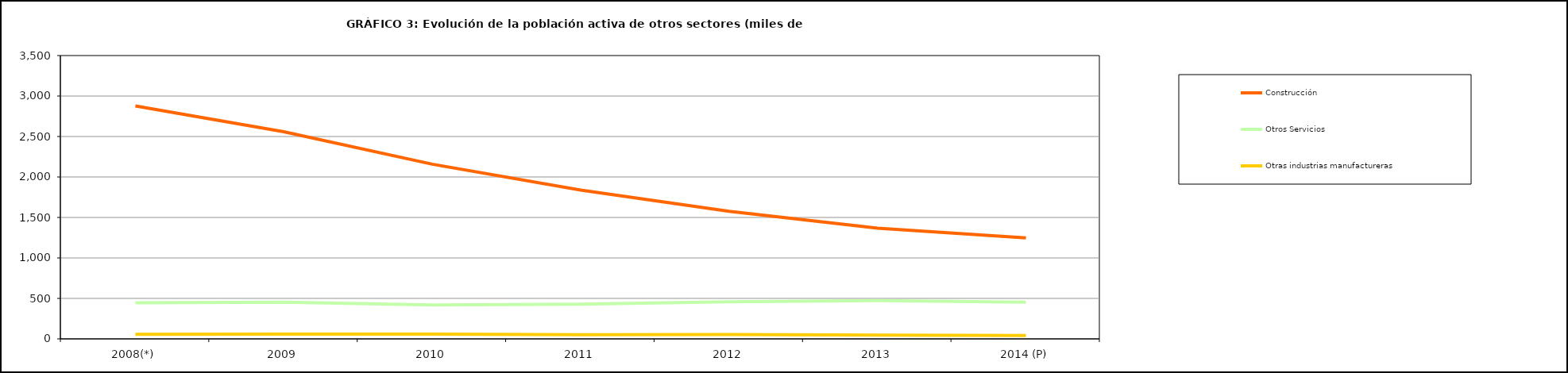
| Category | Construcción | Otros Servicios | Otras industrias manufactureras |
|---|---|---|---|
| 2008(*) | 2877.8 | 447 | 57.225 |
| 2009 | 2558.825 | 453.325 | 59.2 |
| 2010 | 2158.15 | 418.775 | 58.075 |
| 2011 | 1837.95 | 428.625 | 52.3 |
| 2012 | 1576.925 | 459.15 | 52.8 |
| 2013 | 1366.878 | 473.15 | 46.85 |
| 2014 (P) | 1247.2 | 454.2 | 42.2 |